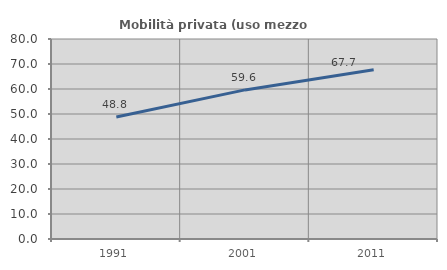
| Category | Mobilità privata (uso mezzo privato) |
|---|---|
| 1991.0 | 48.817 |
| 2001.0 | 59.64 |
| 2011.0 | 67.712 |